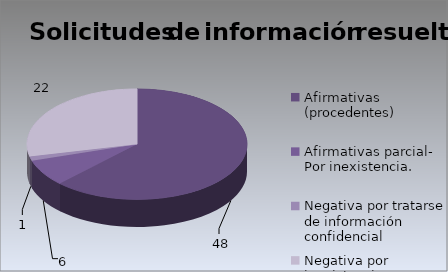
| Category | Series 0 |
|---|---|
| Afirmativas (procedentes) | 48 |
| Afirmativas parcial- Por inexistencia.                                                                                 | 6 |
| Negativa por tratarse de información confidencial                                                                                                                                                                                                               | 1 |
| Negativa por inexistencia                                                                                                                                                                                                                                       | 22 |